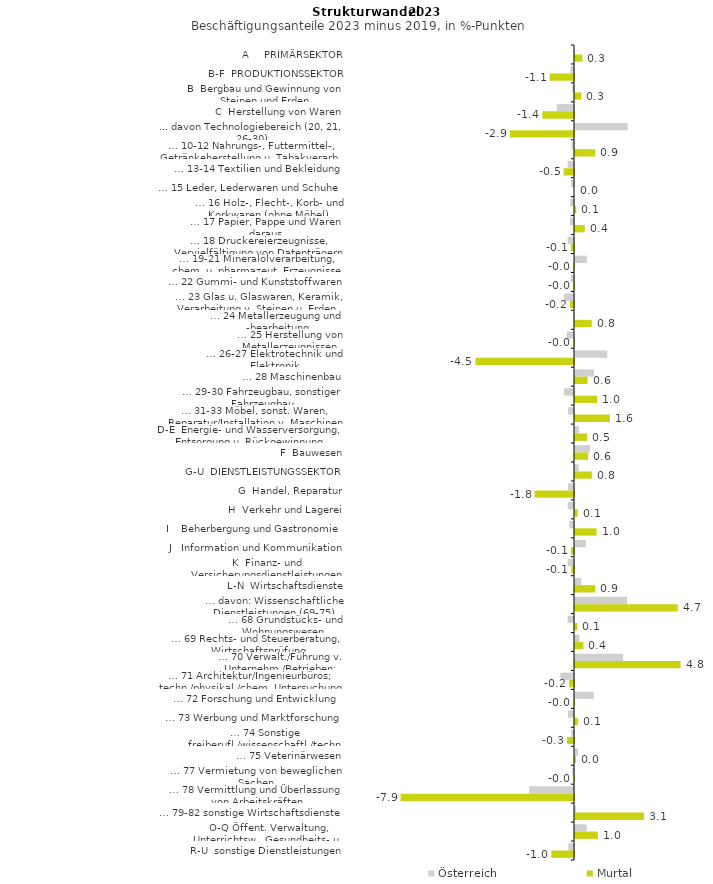
| Category | Österreich | Murtal |
|---|---|---|
| A     PRIMÄRSEKTOR | -0.007 | 0.338 |
| B-F  PRODUKTIONSSEKTOR | -0.161 | -1.103 |
| B  Bergbau und Gewinnung von Steinen und Erden | -0.086 | 0.286 |
| C  Herstellung von Waren | -0.782 | -1.437 |
| ... davon Technologiebereich (20, 21, 26-30) | 2.393 | -2.913 |
| … 10-12 Nahrungs-, Futtermittel-, Getränkeherstellung u. Tabakverarb. | -0.116 | 0.923 |
| … 13-14 Textilien und Bekleidung | -0.289 | -0.472 |
| … 15 Leder, Lederwaren und Schuhe | -0.13 | 0 |
| … 16 Holz-, Flecht-, Korb- und Korkwaren (ohne Möbel)  | -0.177 | 0.054 |
| … 17 Papier, Pappe und Waren daraus  | -0.185 | 0.444 |
| … 18 Druckereierzeugnisse, Vervielfältigung von Datenträgern | -0.288 | -0.143 |
| … 19-21 Mineralölverarbeitung, chem. u. pharmazeut. Erzeugnisse | 0.549 | -0.027 |
| … 22 Gummi- und Kunststoffwaren | -0.139 | -0.031 |
| … 23 Glas u. Glaswaren, Keramik, Verarbeitung v. Steinen u. Erden  | -0.462 | -0.191 |
| … 24 Metallerzeugung und -bearbeitung | -0.032 | 0.758 |
| … 25 Herstellung von Metallerzeugnissen  | -0.325 | -0.014 |
| … 26-27 Elektrotechnik und Elektronik | 1.462 | -4.479 |
| … 28 Maschinenbau | 0.864 | 0.572 |
| … 29-30 Fahrzeugbau, sonstiger Fahrzeugbau | -0.462 | 1.006 |
| … 31-33 Möbel, sonst. Waren, Reparatur/Installation v. Maschinen | -0.273 | 1.586 |
| D-E  Energie- und Wasserversorgung, Entsorgung u. Rückgewinnung | 0.184 | 0.55 |
| F  Bauwesen | 0.684 | 0.601 |
| G-U  DIENSTLEISTUNGSSEKTOR | 0.167 | 0.765 |
| G  Handel, Reparatur | -0.273 | -1.791 |
| H  Verkehr und Lagerei | -0.287 | 0.127 |
| I    Beherbergung und Gastronomie | -0.218 | 0.982 |
| J   Information und Kommunikation | 0.499 | -0.142 |
| K  Finanz- und Versicherungsdienstleistungen | -0.279 | -0.123 |
| L-N  Wirtschaftsdienste | 0.279 | 0.924 |
| … davon: Wissenschaftliche Dienstleistungen (69-75) | 2.367 | 4.669 |
| … 68 Grundstücks- und Wohnungswesen  | -0.294 | 0.112 |
| … 69 Rechts- und Steuerberatung, Wirtschaftsprüfung | 0.205 | 0.384 |
| … 70 Verwalt./Führung v. Unternehm./Betrieben; Unternehmensberat. | 2.188 | 4.797 |
| … 71 Architektur/Ingenieurbüros; techn./physikal./chem. Untersuchung | -0.622 | -0.227 |
| … 72 Forschung und Entwicklung  | 0.854 | -0.015 |
| … 73 Werbung und Marktforschung | -0.273 | 0.131 |
| … 74 Sonstige freiberufl./wissenschaftl./techn. Tätigkeiten | -0.124 | -0.315 |
| … 75 Veterinärwesen | 0.14 | 0.043 |
| … 77 Vermietung von beweglichen Sachen  | -0.077 | -0.027 |
| … 78 Vermittlung und Überlassung von Arbeitskräften | -2.035 | -7.884 |
| … 79-82 sonstige Wirtschaftsdienste | 0.039 | 3.13 |
| O-Q Öffent. Verwaltung, Unterrichtsw., Gesundheits- u. Sozialwesen | 0.535 | 1.038 |
| R-U  sonstige Dienstleistungen | -0.256 | -1.031 |